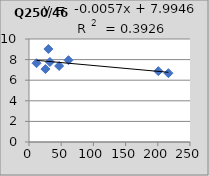
| Category | Q250/465 |
|---|---|
| 25.5 | 7.08 |
| 61.3 | 7.94 |
| 11.7 | 7.65 |
| 216.5 | 6.68 |
| 46.8 | 7.38 |
| 32.5 | 7.77 |
| 200.8 | 6.88 |
| 30.1 | 9.03 |